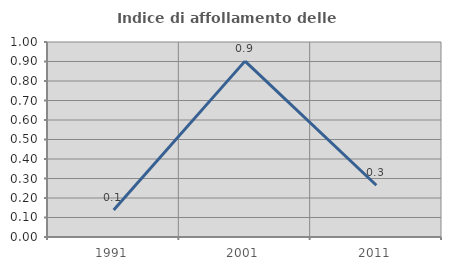
| Category | Indice di affollamento delle abitazioni  |
|---|---|
| 1991.0 | 0.139 |
| 2001.0 | 0.902 |
| 2011.0 | 0.265 |